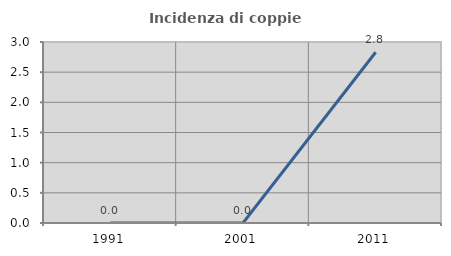
| Category | Incidenza di coppie miste |
|---|---|
| 1991.0 | 0 |
| 2001.0 | 0 |
| 2011.0 | 2.83 |